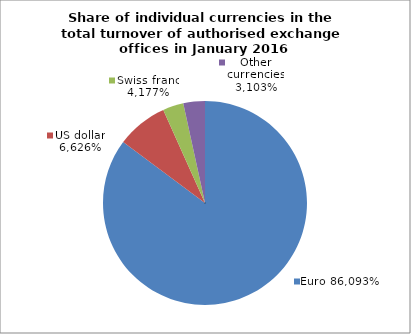
| Category | EUR |
|---|---|
| 0 | 0.852 |
| 1 | 0.081 |
| 2 | 0.033 |
| 3 | 0.034 |